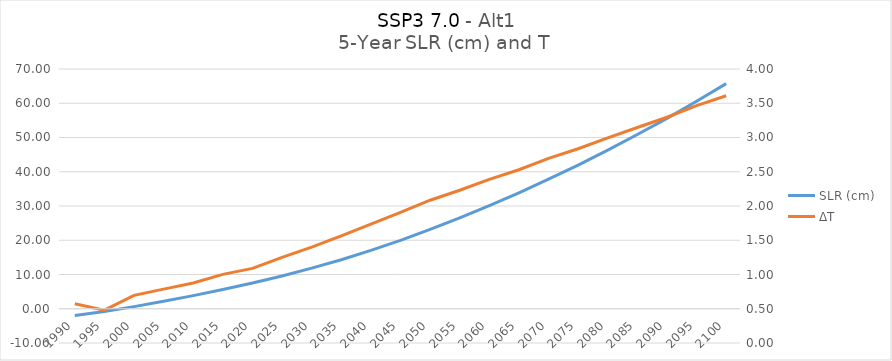
| Category | SLR (cm) |
|---|---|
| 1990.0 | -1.941 |
| 1995.0 | -0.818 |
| 2000.0 | 0.621 |
| 2005.0 | 2.18 |
| 2010.0 | 3.834 |
| 2015.0 | 5.633 |
| 2020.0 | 7.505 |
| 2025.0 | 9.582 |
| 2030.0 | 11.846 |
| 2035.0 | 14.321 |
| 2040.0 | 17.03 |
| 2045.0 | 19.966 |
| 2050.0 | 23.151 |
| 2055.0 | 26.518 |
| 2060.0 | 30.097 |
| 2065.0 | 33.846 |
| 2070.0 | 37.817 |
| 2075.0 | 41.961 |
| 2080.0 | 46.315 |
| 2085.0 | 50.863 |
| 2090.0 | 55.601 |
| 2095.0 | 60.57 |
| 2100.0 | 65.721 |